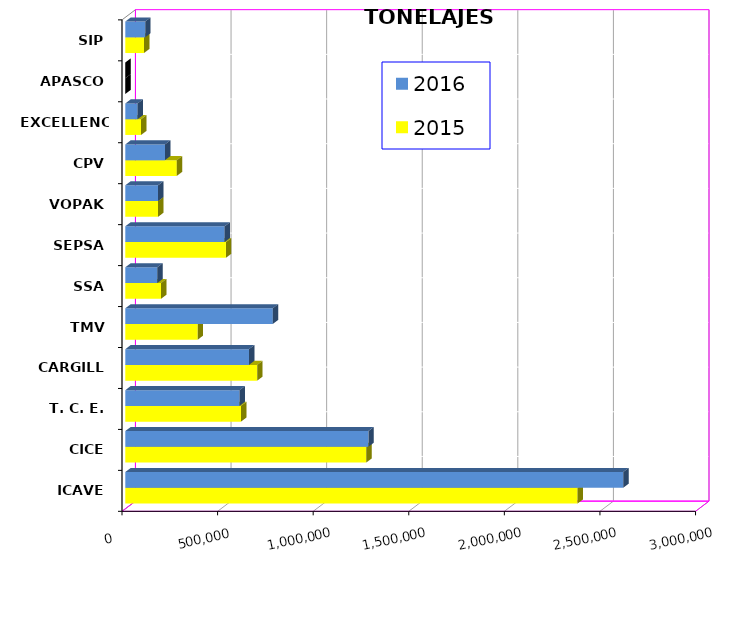
| Category | 2015 | 2016 |
|---|---|---|
| ICAVE | 2365637.684 | 2604592.93 |
| CICE | 1260326.008 | 1271469.618 |
| T. C. E. | 605262.11 | 597490.569 |
| CARGILL | 690018.3 | 646951.534 |
| TMV | 378563.4 | 771621.691 |
| SSA | 187241.271 | 167401.488 |
| SEPSA | 526355.91 | 519397.114 |
| VOPAK | 171155.029 | 171311.654 |
| CPV | 269430.95 | 207626.206 |
| EXCELLENCE | 82532.05 | 64334.807 |
| APASCO | 0 | 0 |
| SIP | 97721.66 | 104055.34 |